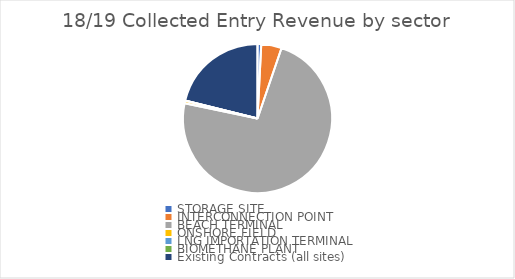
| Category | 01-Oct-2018 to 30-Sep-2019 |
|---|---|
| STORAGE SITE | 0.008 |
| INTERCONNECTION POINT | 0.044 |
| BEACH TERMINAL | 0.731 |
| ONSHORE FIELD | 0.006 |
| LNG IMPORTATION TERMINAL | 0 |
| BIOMETHANE PLANT | 0 |
| Existing Contracts (all sites) | 0.211 |